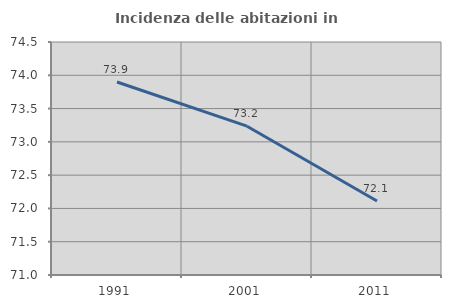
| Category | Incidenza delle abitazioni in proprietà  |
|---|---|
| 1991.0 | 73.899 |
| 2001.0 | 73.235 |
| 2011.0 | 72.113 |